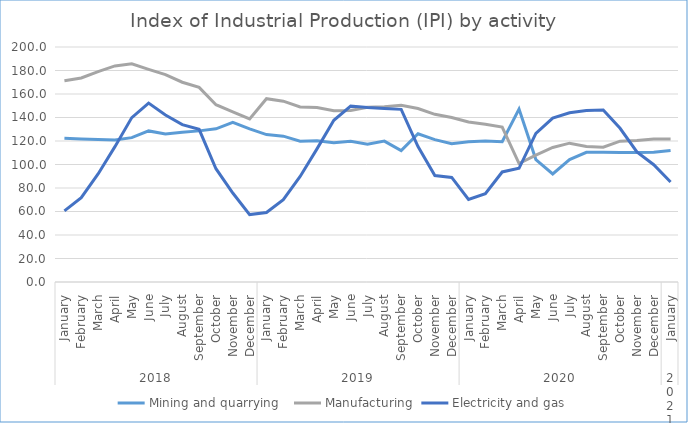
| Category | Mining and quarrying   | Manufacturing | Electricity and gas |
|---|---|---|---|
| 0 | 122.27 | 171.27 | 60.55 |
| 1 | 121.68 | 173.65 | 71.77 |
| 2 | 121.34 | 179.1 | 91.95 |
| 3 | 120.86 | 183.92 | 115.21 |
| 4 | 122.84 | 185.71 | 139.9 |
| 5 | 128.58 | 180.98 | 152.24 |
| 6 | 126 | 176.46 | 142.08 |
| 7 | 127.52 | 170.01 | 133.96 |
| 8 | 128.62 | 165.64 | 129.9 |
| 9 | 130.34 | 150.89 | 96.41 |
| 10 | 135.86 | 144.85 | 75.75 |
| 11 | 130.35 | 138.79 | 57.38 |
| 12 | 125.45 | 155.98 | 59.15 |
| 13 | 124.14 | 153.87 | 70.1 |
| 14 | 119.87 | 148.98 | 89.82 |
| 15 | 120.11 | 148.54 | 113.29 |
| 16 | 118.43 | 145.76 | 137.57 |
| 17 | 119.81 | 146.05 | 149.7 |
| 18 | 117.33 | 148.68 | 148.56 |
| 19 | 119.89 | 149.23 | 147.74 |
| 20 | 111.81 | 150.42 | 146.92 |
| 21 | 126.188 | 147.61 | 115.237 |
| 22 | 121.13 | 142.69 | 90.54 |
| 23 | 117.67 | 139.99 | 88.97 |
| 24 | 119.34 | 136.15 | 70.29 |
| 25 | 119.94 | 134.33 | 75.21 |
| 26 | 119.36 | 131.91 | 93.65 |
| 27 | 147.17 | 100.84 | 96.77 |
| 28 | 104.241 | 107.99 | 126.45 |
| 29 | 91.98 | 114.521 | 139.52 |
| 30 | 104.21 | 118.159 | 144.04 |
| 31 | 110.42 | 115.41 | 145.89 |
| 32 | 110.395 | 114.682 | 146.405 |
| 33 | 110.3 | 119.88 | 130.822 |
| 34 | 110.28 | 120.487 | 110.681 |
| 35 | 110.378 | 121.664 | 99.825 |
| 36 | 111.9 | 121.691 | 85.058 |